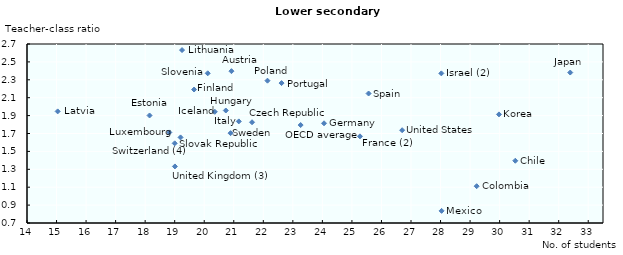
| Category | Teacher-class ratio |
|---|---|
| 20.921193375862 | 2.397 |
| 30.530675267637 | 1.396 |
| 21.617896180624 | 1.826 |
| 18.148407987048 | 1.901 |
| 19.655969191271 | 2.191 |
| 25.272234714603 | 1.668 |
| 24.056092207311 | 1.814 |
| 20.730582388743 | 1.957 |
| 20.358520900322 | 1.942 |
| 28.027551842896 | 2.372 |
| 21.170707058408 | 1.835 |
| 32.391165657945 | 2.381 |
| 29.978425047438 | 1.914 |
| 15.038030095759 | 1.947 |
| 18.81841876629 | 1.712 |
| 28.035844561288 | 0.835 |
| 22.141158377001 | 2.29 |
| 22.617939723674 | 2.263 |
| 19.198525147071 | 1.656 |
| 20.118042584983 | 2.373 |
| 25.563942442022 | 2.147 |
| 20.891520136132 | 1.704 |
| 19.0 | 1.59 |
| 33.603244568124 | 2.005 |
| 19.007525794186 | 1.332 |
| 26.700812339895 | 1.737 |
| 23.264016529012185 | 1.794 |
| 29.222867950845 | 1.111 |
| 19.249482739845 | 2.632 |